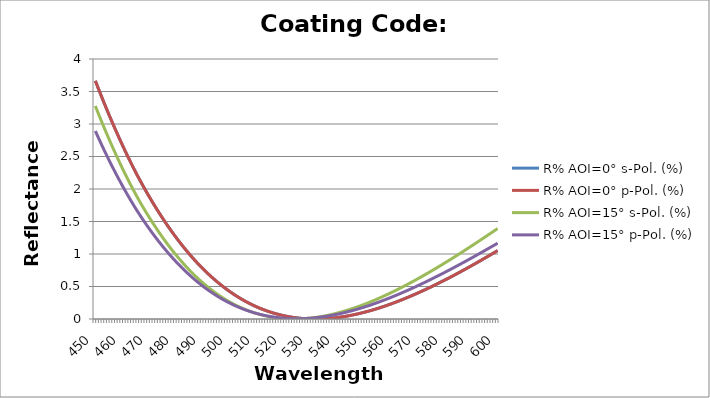
| Category | R% AOI=0° s-Pol. (%) | R% AOI=0° p-Pol. (%) | R% AOI=15° s-Pol. (%) | R% AOI=15° p-Pol. (%) |
|---|---|---|---|---|
| 450.0 | 3.665 | 3.665 | 3.277 | 2.892 |
| 451.0 | 3.558 | 3.558 | 3.173 | 2.8 |
| 452.0 | 3.454 | 3.454 | 3.071 | 2.711 |
| 453.0 | 3.351 | 3.351 | 2.971 | 2.623 |
| 454.0 | 3.251 | 3.251 | 2.873 | 2.537 |
| 455.0 | 3.152 | 3.152 | 2.777 | 2.453 |
| 456.0 | 3.054 | 3.054 | 2.683 | 2.37 |
| 457.0 | 2.959 | 2.959 | 2.591 | 2.289 |
| 458.0 | 2.866 | 2.866 | 2.5 | 2.21 |
| 459.0 | 2.774 | 2.774 | 2.412 | 2.133 |
| 460.0 | 2.684 | 2.684 | 2.326 | 2.057 |
| 461.0 | 2.596 | 2.596 | 2.241 | 1.982 |
| 462.0 | 2.509 | 2.509 | 2.158 | 1.91 |
| 463.0 | 2.425 | 2.425 | 2.077 | 1.839 |
| 464.0 | 2.342 | 2.342 | 1.998 | 1.77 |
| 465.0 | 2.26 | 2.26 | 1.921 | 1.702 |
| 466.0 | 2.183 | 2.183 | 1.848 | 1.638 |
| 467.0 | 2.107 | 2.107 | 1.776 | 1.574 |
| 468.0 | 2.032 | 2.032 | 1.705 | 1.513 |
| 469.0 | 1.959 | 1.959 | 1.636 | 1.453 |
| 470.0 | 1.888 | 1.888 | 1.57 | 1.394 |
| 471.0 | 1.818 | 1.818 | 1.504 | 1.337 |
| 472.0 | 1.75 | 1.75 | 1.441 | 1.281 |
| 473.0 | 1.684 | 1.684 | 1.379 | 1.227 |
| 474.0 | 1.619 | 1.619 | 1.318 | 1.174 |
| 475.0 | 1.555 | 1.555 | 1.259 | 1.122 |
| 476.0 | 1.493 | 1.493 | 1.202 | 1.072 |
| 477.0 | 1.433 | 1.433 | 1.146 | 1.024 |
| 478.0 | 1.374 | 1.374 | 1.092 | 0.976 |
| 479.0 | 1.316 | 1.316 | 1.04 | 0.93 |
| 480.0 | 1.26 | 1.26 | 0.989 | 0.885 |
| 481.0 | 1.206 | 1.206 | 0.939 | 0.842 |
| 482.0 | 1.152 | 1.152 | 0.891 | 0.8 |
| 483.0 | 1.101 | 1.101 | 0.845 | 0.759 |
| 484.0 | 1.05 | 1.05 | 0.8 | 0.719 |
| 485.0 | 1.001 | 1.001 | 0.756 | 0.681 |
| 486.0 | 0.954 | 0.954 | 0.714 | 0.644 |
| 487.0 | 0.908 | 0.908 | 0.673 | 0.608 |
| 488.0 | 0.863 | 0.863 | 0.634 | 0.573 |
| 489.0 | 0.819 | 0.819 | 0.595 | 0.54 |
| 490.0 | 0.777 | 0.777 | 0.559 | 0.508 |
| 491.0 | 0.736 | 0.736 | 0.524 | 0.477 |
| 492.0 | 0.697 | 0.697 | 0.49 | 0.447 |
| 493.0 | 0.659 | 0.659 | 0.457 | 0.418 |
| 494.0 | 0.622 | 0.622 | 0.426 | 0.39 |
| 495.0 | 0.586 | 0.586 | 0.396 | 0.364 |
| 496.0 | 0.552 | 0.552 | 0.367 | 0.338 |
| 497.0 | 0.519 | 0.519 | 0.34 | 0.314 |
| 498.0 | 0.487 | 0.487 | 0.314 | 0.29 |
| 499.0 | 0.456 | 0.456 | 0.288 | 0.268 |
| 500.0 | 0.426 | 0.426 | 0.264 | 0.247 |
| 501.0 | 0.397 | 0.397 | 0.242 | 0.226 |
| 502.0 | 0.37 | 0.37 | 0.22 | 0.207 |
| 503.0 | 0.344 | 0.344 | 0.2 | 0.189 |
| 504.0 | 0.318 | 0.318 | 0.18 | 0.171 |
| 505.0 | 0.294 | 0.294 | 0.162 | 0.155 |
| 506.0 | 0.271 | 0.271 | 0.145 | 0.139 |
| 507.0 | 0.249 | 0.249 | 0.128 | 0.125 |
| 508.0 | 0.228 | 0.228 | 0.113 | 0.111 |
| 509.0 | 0.208 | 0.208 | 0.099 | 0.098 |
| 510.0 | 0.189 | 0.189 | 0.086 | 0.086 |
| 511.0 | 0.172 | 0.172 | 0.074 | 0.076 |
| 512.0 | 0.155 | 0.155 | 0.063 | 0.065 |
| 513.0 | 0.139 | 0.139 | 0.053 | 0.056 |
| 514.0 | 0.124 | 0.124 | 0.044 | 0.048 |
| 515.0 | 0.11 | 0.11 | 0.036 | 0.04 |
| 516.0 | 0.097 | 0.097 | 0.029 | 0.033 |
| 517.0 | 0.085 | 0.085 | 0.022 | 0.027 |
| 518.0 | 0.073 | 0.073 | 0.017 | 0.022 |
| 519.0 | 0.063 | 0.063 | 0.012 | 0.017 |
| 520.0 | 0.053 | 0.053 | 0.008 | 0.013 |
| 521.0 | 0.044 | 0.044 | 0.005 | 0.01 |
| 522.0 | 0.036 | 0.036 | 0.003 | 0.008 |
| 523.0 | 0.029 | 0.029 | 0.002 | 0.006 |
| 524.0 | 0.023 | 0.023 | 0.001 | 0.005 |
| 525.0 | 0.018 | 0.018 | 0.001 | 0.004 |
| 526.0 | 0.013 | 0.013 | 0.002 | 0.005 |
| 527.0 | 0.009 | 0.009 | 0.004 | 0.006 |
| 528.0 | 0.006 | 0.006 | 0.006 | 0.007 |
| 529.0 | 0.003 | 0.003 | 0.01 | 0.009 |
| 530.0 | 0.001 | 0.001 | 0.014 | 0.012 |
| 531.0 | 0 | 0 | 0.018 | 0.016 |
| 532.0 | 0 | 0 | 0.024 | 0.02 |
| 533.0 | 0 | 0 | 0.029 | 0.024 |
| 534.0 | 0.001 | 0.001 | 0.036 | 0.029 |
| 535.0 | 0.003 | 0.003 | 0.043 | 0.035 |
| 536.0 | 0.005 | 0.005 | 0.051 | 0.041 |
| 537.0 | 0.008 | 0.008 | 0.06 | 0.048 |
| 538.0 | 0.012 | 0.012 | 0.069 | 0.055 |
| 539.0 | 0.016 | 0.016 | 0.078 | 0.063 |
| 540.0 | 0.021 | 0.021 | 0.089 | 0.071 |
| 541.0 | 0.026 | 0.026 | 0.1 | 0.08 |
| 542.0 | 0.032 | 0.032 | 0.111 | 0.09 |
| 543.0 | 0.039 | 0.039 | 0.123 | 0.099 |
| 544.0 | 0.046 | 0.046 | 0.136 | 0.11 |
| 545.0 | 0.054 | 0.054 | 0.149 | 0.12 |
| 546.0 | 0.062 | 0.062 | 0.162 | 0.131 |
| 547.0 | 0.071 | 0.071 | 0.176 | 0.143 |
| 548.0 | 0.08 | 0.08 | 0.191 | 0.155 |
| 549.0 | 0.09 | 0.09 | 0.206 | 0.167 |
| 550.0 | 0.1 | 0.1 | 0.221 | 0.18 |
| 551.0 | 0.111 | 0.111 | 0.237 | 0.194 |
| 552.0 | 0.122 | 0.122 | 0.254 | 0.207 |
| 553.0 | 0.134 | 0.134 | 0.271 | 0.221 |
| 554.0 | 0.146 | 0.146 | 0.288 | 0.235 |
| 555.0 | 0.159 | 0.159 | 0.306 | 0.25 |
| 556.0 | 0.172 | 0.172 | 0.324 | 0.265 |
| 557.0 | 0.186 | 0.186 | 0.342 | 0.28 |
| 558.0 | 0.2 | 0.2 | 0.361 | 0.296 |
| 559.0 | 0.214 | 0.214 | 0.38 | 0.312 |
| 560.0 | 0.228 | 0.228 | 0.4 | 0.329 |
| 561.0 | 0.244 | 0.244 | 0.42 | 0.345 |
| 562.0 | 0.259 | 0.259 | 0.44 | 0.362 |
| 563.0 | 0.275 | 0.275 | 0.461 | 0.38 |
| 564.0 | 0.291 | 0.291 | 0.482 | 0.397 |
| 565.0 | 0.308 | 0.308 | 0.503 | 0.415 |
| 566.0 | 0.325 | 0.325 | 0.524 | 0.433 |
| 567.0 | 0.342 | 0.342 | 0.546 | 0.451 |
| 568.0 | 0.36 | 0.36 | 0.569 | 0.47 |
| 569.0 | 0.377 | 0.377 | 0.591 | 0.489 |
| 570.0 | 0.396 | 0.396 | 0.614 | 0.508 |
| 571.0 | 0.414 | 0.414 | 0.637 | 0.527 |
| 572.0 | 0.433 | 0.433 | 0.66 | 0.547 |
| 573.0 | 0.452 | 0.452 | 0.684 | 0.567 |
| 574.0 | 0.471 | 0.471 | 0.707 | 0.587 |
| 575.0 | 0.491 | 0.491 | 0.731 | 0.607 |
| 576.0 | 0.511 | 0.511 | 0.756 | 0.628 |
| 577.0 | 0.531 | 0.531 | 0.78 | 0.648 |
| 578.0 | 0.551 | 0.551 | 0.805 | 0.669 |
| 579.0 | 0.572 | 0.572 | 0.83 | 0.69 |
| 580.0 | 0.593 | 0.593 | 0.855 | 0.711 |
| 581.0 | 0.614 | 0.614 | 0.88 | 0.733 |
| 582.0 | 0.635 | 0.635 | 0.906 | 0.754 |
| 583.0 | 0.657 | 0.657 | 0.932 | 0.776 |
| 584.0 | 0.679 | 0.679 | 0.957 | 0.798 |
| 585.0 | 0.701 | 0.701 | 0.984 | 0.82 |
| 586.0 | 0.723 | 0.723 | 1.01 | 0.842 |
| 587.0 | 0.746 | 0.746 | 1.036 | 0.864 |
| 588.0 | 0.768 | 0.768 | 1.063 | 0.887 |
| 589.0 | 0.791 | 0.791 | 1.09 | 0.91 |
| 590.0 | 0.814 | 0.814 | 1.116 | 0.932 |
| 591.0 | 0.837 | 0.837 | 1.144 | 0.955 |
| 592.0 | 0.86 | 0.86 | 1.171 | 0.978 |
| 593.0 | 0.884 | 0.884 | 1.198 | 1.002 |
| 594.0 | 0.908 | 0.908 | 1.225 | 1.025 |
| 595.0 | 0.931 | 0.931 | 1.253 | 1.048 |
| 596.0 | 0.955 | 0.955 | 1.28 | 1.072 |
| 597.0 | 0.979 | 0.979 | 1.308 | 1.095 |
| 598.0 | 1.004 | 1.004 | 1.336 | 1.119 |
| 599.0 | 1.028 | 1.028 | 1.364 | 1.142 |
| 600.0 | 1.052 | 1.052 | 1.392 | 1.166 |